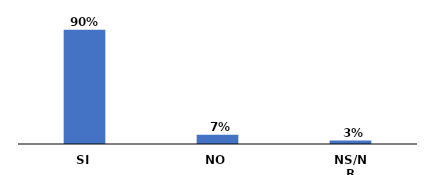
| Category | Series 0 |
|---|---|
| SI | 0.899 |
| NO | 0.074 |
| NS/NR | 0.027 |